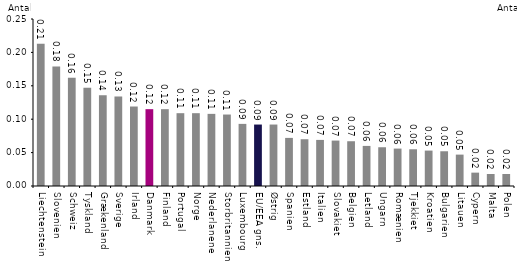
| Category | Ph.d.-dimittender pr. kandidatdimittend |
|---|---|
| Liechtenstein | 0.213 |
| Slovenien | 0.179 |
| Schweiz | 0.162 |
| Tyskland | 0.147 |
| Grækenland | 0.136 |
| Sverige | 0.134 |
| Irland | 0.119 |
| Danmark | 0.115 |
| Finland | 0.115 |
| Portugal | 0.109 |
| Norge | 0.109 |
| Nederlanene | 0.108 |
| Storbritannien | 0.107 |
| Luxembourg | 0.093 |
| EU/EEA gns. | 0.092 |
| Østrig | 0.092 |
| Spanien | 0.072 |
| Estland | 0.07 |
| Italien | 0.069 |
| Slovakiet | 0.068 |
| Belgien | 0.067 |
| Letland | 0.06 |
| Ungarn | 0.058 |
| Romænien | 0.056 |
| Tjekkiet | 0.055 |
| Kroatien | 0.053 |
| Bulgarien | 0.052 |
| Litauen | 0.047 |
| Cypern | 0.02 |
| Malta | 0.018 |
| Polen | 0.018 |